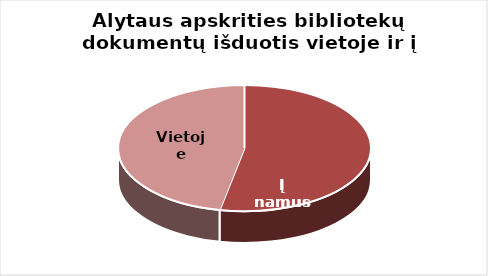
| Category | Series 0 |
|---|---|
| Į namus | 651255 |
| Vietoje | 574585 |